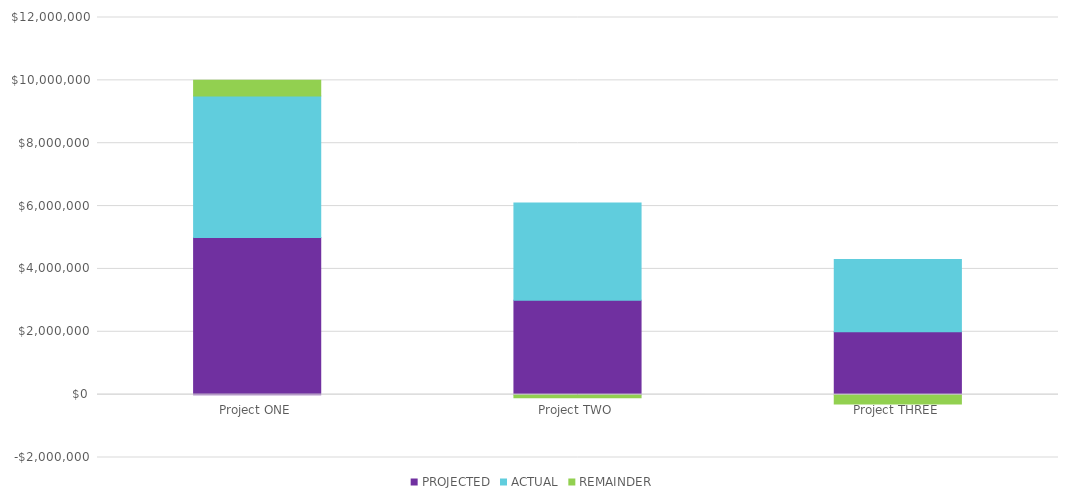
| Category | PROJECTED | ACTUAL | REMAINDER |
|---|---|---|---|
| Project ONE | 5000000 | 4500000 | 500000 |
| Project TWO | 3000000 | 3100000 | -100000 |
| Project THREE | 2000000 | 2300000 | -300000 |